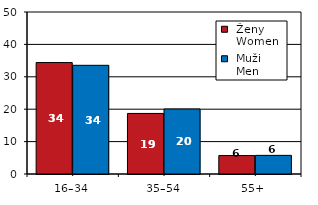
| Category |  Ženy 
 Women |  Muži 
 Men |
|---|---|---|
| 16–34 | 34.39 | 33.55 |
| 35–54 | 18.69 | 20.07 |
| 55+  | 5.69 | 5.75 |